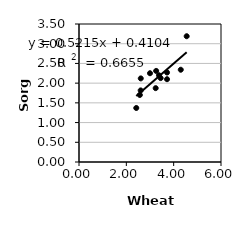
| Category | Series 0 |
|---|---|
| 2.42 | 1.37 |
| 2.57 | 1.7 |
| 3.72 | 2.27 |
| 3.72 | 2.1 |
| 2.61 | 2.12 |
| 3.0 | 2.251 |
| 3.24 | 1.873 |
| 3.26 | 2.31 |
| 3.45 | 2.128 |
| 4.55 | 3.19 |
| 4.3 | 2.34 |
| 3.38 | 2.2 |
| 2.6054916274 | 1.815 |